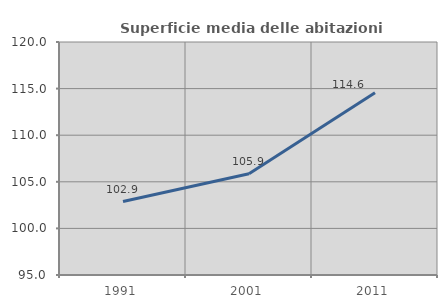
| Category | Superficie media delle abitazioni occupate |
|---|---|
| 1991.0 | 102.882 |
| 2001.0 | 105.854 |
| 2011.0 | 114.567 |